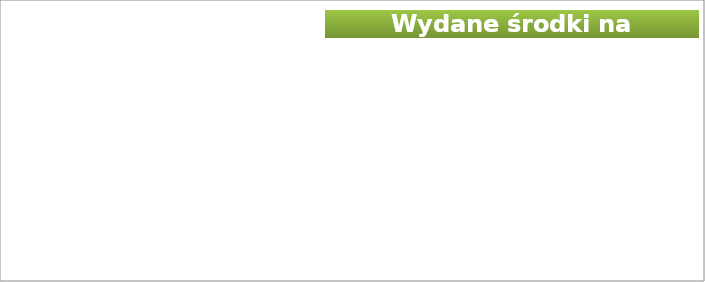
| Category | Kwota wydanych środków na aktywizację |
|---|---|
| 2018 | 13206864.77 |
| 2019 | 13127068.03 |
| 2020 | 11269754.78 |
| 2021 | 19592265.48 |